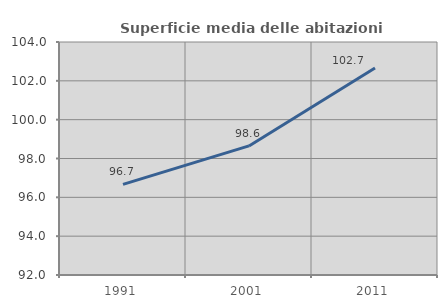
| Category | Superficie media delle abitazioni occupate |
|---|---|
| 1991.0 | 96.665 |
| 2001.0 | 98.648 |
| 2011.0 | 102.659 |